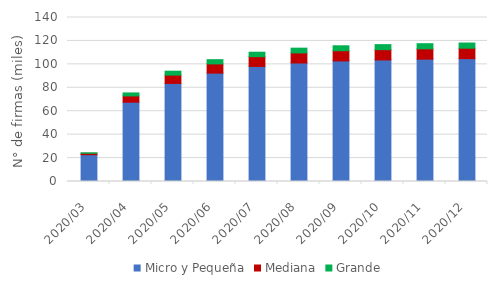
| Category | Micro y Pequeña | Mediana | Grande |
|---|---|---|---|
| 2020-03-01 | 22.878 | 1.19 | 0.427 |
| 2020-04-01 | 67.689 | 5.376 | 2.54 |
| 2020-05-01 | 83.725 | 7.106 | 3.335 |
| 2020-06-01 | 92.513 | 7.877 | 3.623 |
| 2020-07-01 | 98.243 | 8.311 | 3.817 |
| 2020-08-01 | 101.181 | 8.575 | 4.084 |
| 2020-09-01 | 102.933 | 8.723 | 4.199 |
| 2020-10-01 | 103.767 | 8.788 | 4.284 |
| 2020-11-01 | 104.427 | 8.855 | 4.352 |
| 2020-12-01 | 104.893 | 8.901 | 4.412 |